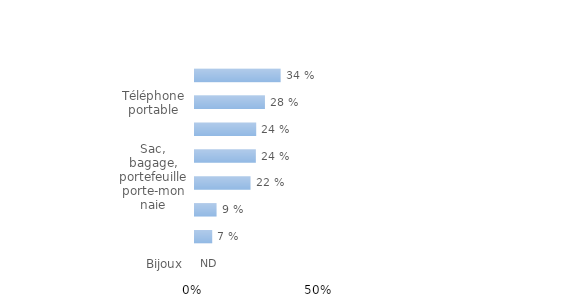
| Category | Series 0 |
|---|---|
| Bijoux | 0 |
| Vêtements | 0.069 |
| Clés | 0.086 |
| Sac, bagage, portefeuille porte-monnaie | 0.222 |
| Chèques, une ou des cartes bancaires | 0.243 |
| Papiers d'identité, carte grise, autres documents adm. | 0.245 |
| Téléphone portable | 0.28 |
| Argent liquide | 0.343 |